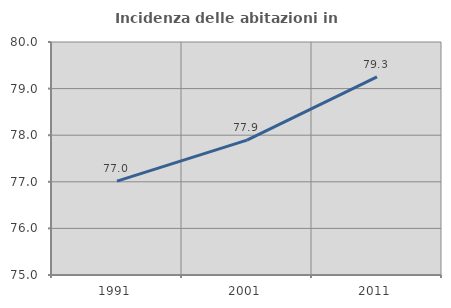
| Category | Incidenza delle abitazioni in proprietà  |
|---|---|
| 1991.0 | 77.014 |
| 2001.0 | 77.894 |
| 2011.0 | 79.252 |